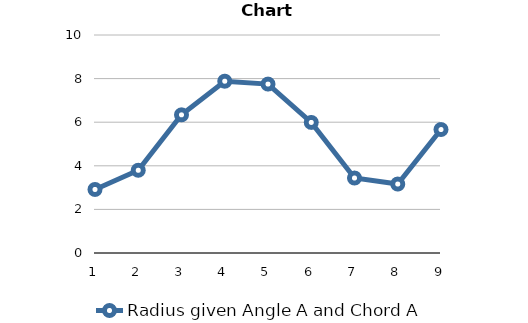
| Category | Radius given Angle A and Chord A |
|---|---|
| 1 | 2.914 |
| 2 | 3.795 |
| 3 | 6.338 |
| 4 | 7.88 |
| 5 | 7.748 |
| 6 | 5.989 |
| 7 | 3.439 |
| 8 | 3.163 |
| 9 | 5.664 |